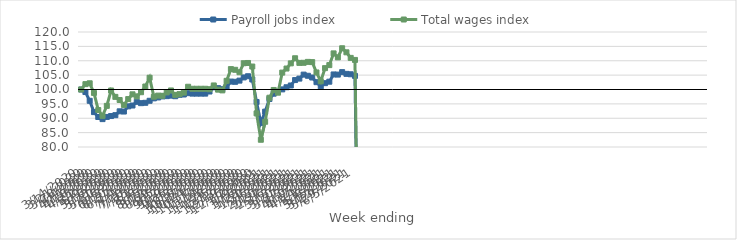
| Category | Payroll jobs index | Total wages index |
|---|---|---|
| 14/03/2020 | 100 | 100 |
| 21/03/2020 | 99.119 | 101.865 |
| 28/03/2020 | 96.071 | 102.162 |
| 04/04/2020 | 92.139 | 98.81 |
| 11/04/2020 | 90.432 | 92.858 |
| 18/04/2020 | 89.696 | 90.839 |
| 25/04/2020 | 90.456 | 94.305 |
| 02/05/2020 | 90.771 | 99.652 |
| 09/05/2020 | 91.076 | 97.433 |
| 16/05/2020 | 92.412 | 96.343 |
| 23/05/2020 | 92.334 | 94.631 |
| 30/05/2020 | 94.137 | 96.666 |
| 06/06/2020 | 94.424 | 98.322 |
| 13/06/2020 | 95.717 | 97.611 |
| 20/06/2020 | 95.25 | 99.049 |
| 27/06/2020 | 95.375 | 101.04 |
| 04/07/2020 | 96.078 | 104.103 |
| 11/07/2020 | 96.913 | 97.491 |
| 18/07/2020 | 97.237 | 97.875 |
| 25/07/2020 | 97.594 | 97.821 |
| 01/08/2020 | 97.688 | 98.975 |
| 08/08/2020 | 97.861 | 99.666 |
| 15/08/2020 | 97.668 | 98.136 |
| 22/08/2020 | 98.153 | 98.384 |
| 29/08/2020 | 98.259 | 98.914 |
| 05/09/2020 | 98.726 | 100.952 |
| 12/09/2020 | 98.566 | 100.254 |
| 19/09/2020 | 98.566 | 100.254 |
| 26/09/2020 | 98.566 | 100.254 |
| 03/10/2020 | 98.566 | 100.254 |
| 10/10/2020 | 99.296 | 100.099 |
| 17/10/2020 | 100.751 | 101.41 |
| 24/10/2020 | 100.463 | 99.947 |
| 31/10/2020 | 100.108 | 99.694 |
| 07/11/2020 | 100.984 | 103.016 |
| 14/11/2020 | 102.754 | 107.097 |
| 21/11/2020 | 102.675 | 106.852 |
| 28/11/2020 | 103.092 | 106 |
| 05/12/2020 | 104.201 | 109.136 |
| 12/12/2020 | 104.61 | 109.227 |
| 19/12/2020 | 103.474 | 107.984 |
| 26/12/2020 | 95.654 | 91.696 |
| 02/01/2021 | 88.384 | 82.52 |
| 09/01/2021 | 92.302 | 88.771 |
| 16/01/2021 | 96.695 | 97.141 |
| 23/01/2021 | 98.548 | 99.837 |
| 30/01/2021 | 99.254 | 98.893 |
| 06/02/2021 | 100.041 | 105.877 |
| 13/02/2021 | 100.777 | 107.29 |
| 20/02/2021 | 101.398 | 109.091 |
| 27/02/2021 | 103.285 | 110.869 |
| 06/03/2021 | 103.792 | 109.25 |
| 13/03/2021 | 105.177 | 109.288 |
| 20/03/2021 | 104.774 | 109.605 |
| 27/03/2021 | 104.169 | 109.53 |
| 03/04/2021 | 102.546 | 105.926 |
| 10/04/2021 | 101.083 | 102.865 |
| 17/04/2021 | 102.205 | 107.433 |
| 24/04/2021 | 102.712 | 108.48 |
| 01/05/2021 | 105.235 | 112.562 |
| 08/05/2021 | 105.188 | 111.174 |
| 15/05/2021 | 106.039 | 114.343 |
| 22/05/2021 | 105.436 | 112.931 |
| 29/05/2021 | 105.294 | 110.996 |
| 05/06/2021 | 104.733 | 110.283 |